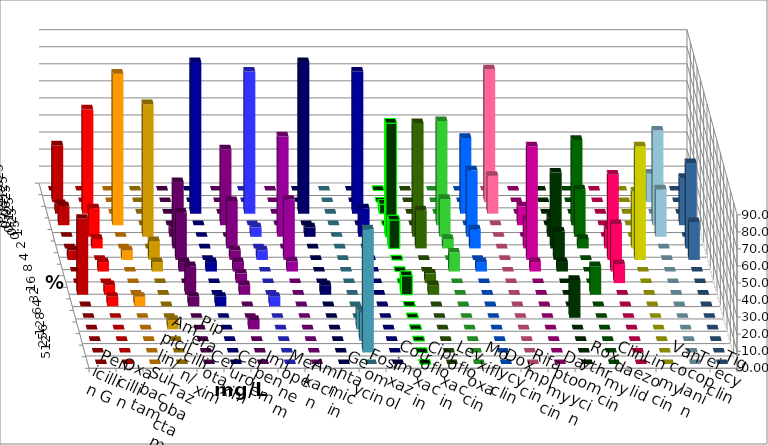
| Category | Penicillin G | Oxacillin | Ampicillin/ Sulbactam | Piperacillin/ Tazobactam | Cefotaxim | Cefuroxim | Imipenem | Meropenem | Amikacin | Gentamicin | Fosfomycin | Cotrimoxazol | Ciprofloxacin | Levofloxacin | Moxifloxacin | Doxycyclin | Rifampicin | Daptomycin | Roxythromycin | Clindamycin | Linezolid | Vancomycin | Teicoplanin | Tigecyclin |
|---|---|---|---|---|---|---|---|---|---|---|---|---|---|---|---|---|---|---|---|---|---|---|---|---|
| 0.015625 | 0 | 0 | 0 | 0 | 0 | 0 | 0 | 0 | 0 | 0 | 0 | 0 | 0 | 0 | 0 | 0 | 0 | 0 | 0 | 0 | 0 | 0 | 0 | 0 |
| 0.03125 | 33.333 | 0 | 0 | 0 | 0 | 0 | 0 | 0 | 0 | 0 | 0 | 0 | 0 | 0 | 0 | 0 | 77.778 | 0 | 0 | 0 | 0 | 0 | 0 | 16.667 |
| 0.0625 | 5.556 | 61.111 | 0 | 0 | 0 | 0 | 88.889 | 83.333 | 0 | 88.889 | 0 | 83.333 | 5.556 | 0 | 0 | 44.444 | 22.222 | 0 | 0 | 0 | 0 | 0 | 0 | 0 |
| 0.125 | 11.111 | 0 | 88.889 | 0 | 0 | 44.444 | 0 | 0 | 0 | 0 | 0 | 0 | 0 | 0 | 61.111 | 0 | 0 | 11.111 | 0 | 50 | 0 | 0 | 27.778 | 55.556 |
| 0.25 | 0 | 16.667 | 0 | 77.778 | 5.556 | 0 | 0 | 5.556 | 58.824 | 5.556 | 0 | 16.667 | 66.667 | 66.667 | 22.222 | 38.889 | 0 | 0 | 11.111 | 27.778 | 0 | 0 | 0 | 27.778 |
| 0.5 | 0 | 5.556 | 0 | 0 | 38.889 | 27.778 | 0 | 0 | 0 | 0 | 0 | 0 | 16.667 | 22.222 | 5.556 | 11.111 | 0 | 16.667 | 44.444 | 5.556 | 11.111 | 33.333 | 50 | 0 |
| 1.0 | 5.556 | 0 | 5.556 | 11.111 | 27.778 | 5.556 | 0 | 5.556 | 35.294 | 0 | 0 | 0 | 0 | 0 | 0 | 0 | 0 | 66.667 | 16.667 | 0 | 50 | 66.667 | 22.222 | 0 |
| 2.0 | 0 | 5.556 | 0 | 5.556 | 5.556 | 5.556 | 5.556 | 0 | 5.882 | 0 | 0 | 0 | 0 | 0 | 11.111 | 5.556 | 0 | 5.556 | 5.556 | 0 | 27.778 | 0 | 0 | 0 |
| 4.0 | 0 | 0 | 0 | 0 | 0 | 5.556 | 0 | 0 | 0 | 0 | 0 | 0 | 0 | 5.556 | 0 | 0 | 0 | 0 | 0 | 0 | 11.111 | 0 | 0 | 0 |
| 8.0 | 44.444 | 5.556 | 0 | 0 | 16.667 | 5.556 | 0 | 0 | 0 | 5.556 | 0 | 0 | 11.111 | 5.556 | 0 | 0 | 0 | 0 | 0 | 16.667 | 0 | 0 | 0 | 0 |
| 16.0 | 0 | 5.556 | 5.556 | 0 | 5.556 | 0 | 5.556 | 5.556 | 0 | 0 | 0 | 0 | 0 | 0 | 0 | 0 | 0 | 0 | 0 | 0 | 0 | 0 | 0 | 0 |
| 32.0 | 0 | 0 | 0 | 0 | 0 | 0 | 0 | 0 | 0 | 0 | 0 | 0 | 0 | 0 | 0 | 0 | 0 | 0 | 22.222 | 0 | 0 | 0 | 0 | 0 |
| 64.0 | 0 | 0 | 0 | 5.556 | 0 | 5.556 | 0 | 0 | 0 | 0 | 11.111 | 0 | 0 | 0 | 0 | 0 | 0 | 0 | 0 | 0 | 0 | 0 | 0 | 0 |
| 128.0 | 0 | 0 | 0 | 0 | 0 | 0 | 0 | 0 | 0 | 0 | 16.667 | 0 | 0 | 0 | 0 | 0 | 0 | 0 | 0 | 0 | 0 | 0 | 0 | 0 |
| 256.0 | 0 | 0 | 0 | 0 | 0 | 0 | 0 | 0 | 0 | 0 | 72.222 | 0 | 0 | 0 | 0 | 0 | 0 | 0 | 0 | 0 | 0 | 0 | 0 | 0 |
| 512.0 | 0 | 0 | 0 | 0 | 0 | 0 | 0 | 0 | 0 | 0 | 0 | 0 | 0 | 0 | 0 | 0 | 0 | 0 | 0 | 0 | 0 | 0 | 0 | 0 |